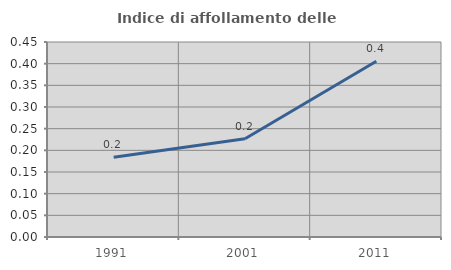
| Category | Indice di affollamento delle abitazioni  |
|---|---|
| 1991.0 | 0.184 |
| 2001.0 | 0.227 |
| 2011.0 | 0.405 |